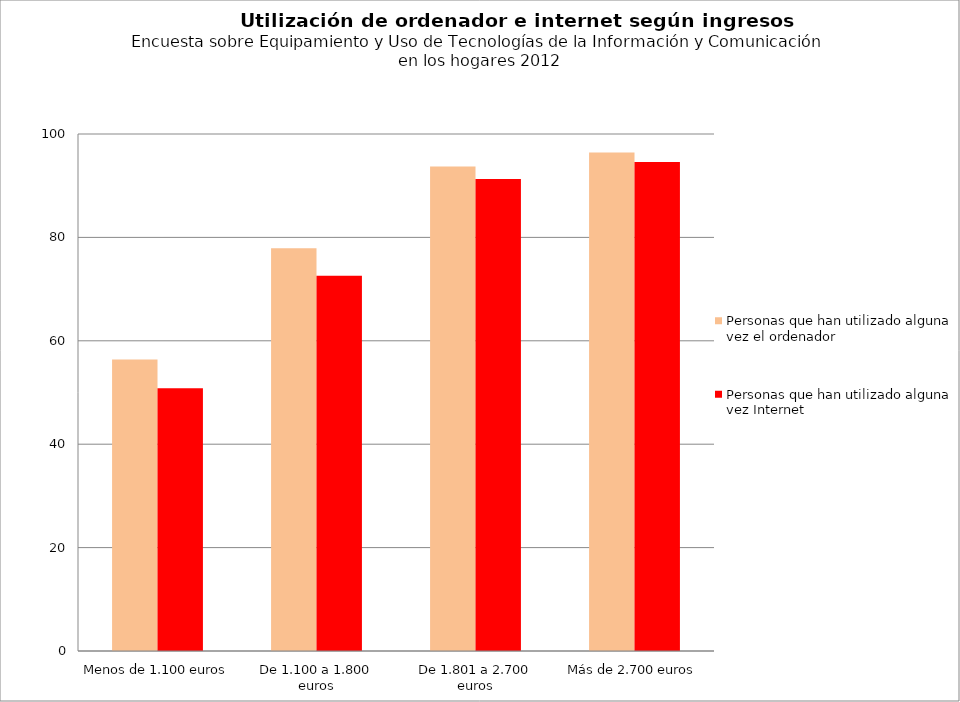
| Category | Personas que han utilizado alguna vez el ordenador | Personas que han utilizado alguna vez Internet |
|---|---|---|
|  Menos de 1.100 euros | 56.4 | 50.8 |
| De 1.100 a 1.800 euros | 77.9 | 72.6 |
| De 1.801 a 2.700 euros | 93.7 | 91.3 |
| Más de 2.700 euros | 96.4 | 94.6 |